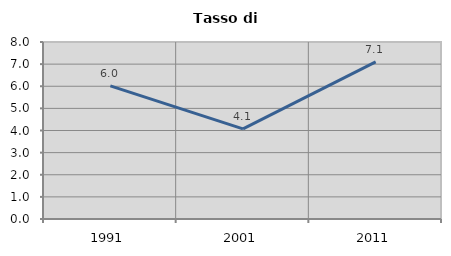
| Category | Tasso di disoccupazione   |
|---|---|
| 1991.0 | 6.016 |
| 2001.0 | 4.071 |
| 2011.0 | 7.103 |